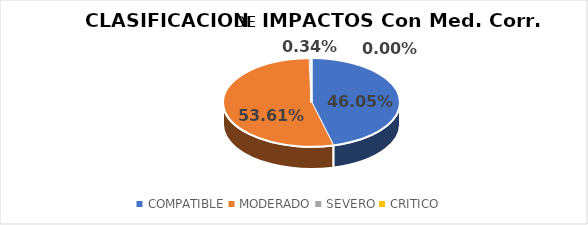
| Category | Series 0 |
|---|---|
| COMPATIBLE | 134 |
| MODERADO | 156 |
| SEVERO | 1 |
| CRITICO | 0 |